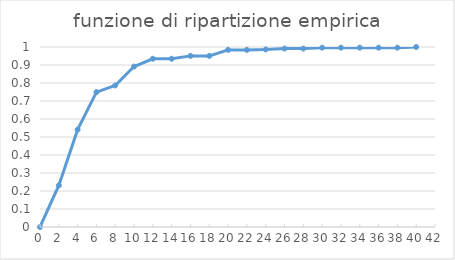
| Category | Series 0 |
|---|---|
| 0.0 | 0 |
| 2.0 | 0.231 |
| 4.0 | 0.541 |
| 6.0 | 0.749 |
| 8.0 | 0.786 |
| 10.0 | 0.891 |
| 12.0 | 0.935 |
| 14.0 | 0.935 |
| 16.0 | 0.951 |
| 18.0 | 0.951 |
| 20.0 | 0.984 |
| 22.0 | 0.984 |
| 24.0 | 0.986 |
| 26.0 | 0.991 |
| 28.0 | 0.991 |
| 30.0 | 0.996 |
| 32.0 | 0.996 |
| 34.0 | 0.996 |
| 36.0 | 0.996 |
| 38.0 | 0.996 |
| 40.0 | 1 |